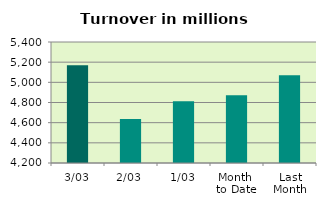
| Category | Series 0 |
|---|---|
| 3/03 | 5169.502 |
| 2/03 | 4636.608 |
| 1/03 | 4812.627 |
| Month 
to Date | 4872.912 |
| Last
Month | 5069.383 |